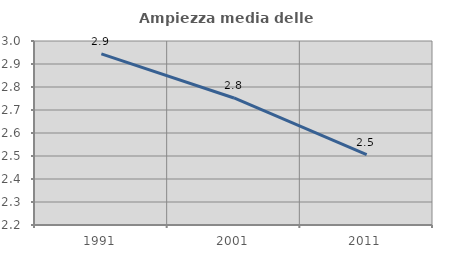
| Category | Ampiezza media delle famiglie |
|---|---|
| 1991.0 | 2.944 |
| 2001.0 | 2.752 |
| 2011.0 | 2.506 |